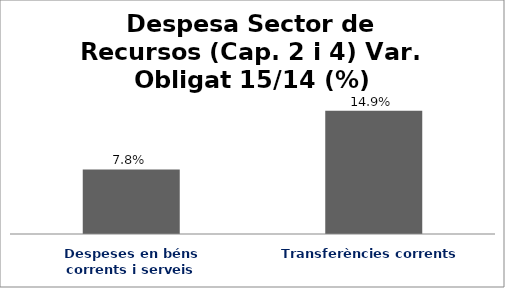
| Category | Series 0 |
|---|---|
| Despeses en béns corrents i serveis | 0.078 |
| Transferències corrents | 0.149 |